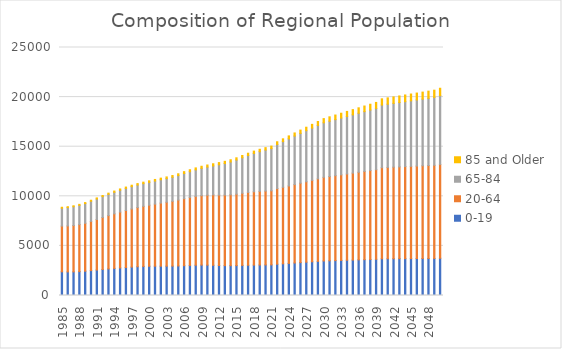
| Category | 0-19  | 20-64 | 65-84 | 85 and Older |
|---|---|---|---|---|
| 1985.0 | 2388.283 | 4611.47 | 1803.225 | 91.523 |
| 1986.0 | 2379.347 | 4632.298 | 1846.96 | 93.928 |
| 1987.0 | 2384.399 | 4671.17 | 1893.194 | 96.044 |
| 1988.0 | 2408.682 | 4743.946 | 1937.765 | 98.385 |
| 1989.0 | 2450.762 | 4830.949 | 1983.835 | 101.109 |
| 1990.0 | 2510.256 | 4960.16 | 2029.072 | 104.161 |
| 1991.0 | 2566.046 | 5095.178 | 2066.251 | 109.24 |
| 1992.0 | 2624.206 | 5236.776 | 2104.465 | 114.738 |
| 1993.0 | 2680.556 | 5375.233 | 2140.87 | 120.306 |
| 1994.0 | 2730.581 | 5502.113 | 2171.887 | 125.732 |
| 1995.0 | 2779.408 | 5628.396 | 2201.745 | 131.247 |
| 1996.0 | 2822.417 | 5744.531 | 2226.803 | 136.625 |
| 1997.0 | 2864.542 | 5860.115 | 2250.524 | 142.057 |
| 1998.0 | 2901.103 | 5965.095 | 2269.469 | 147.318 |
| 1999.0 | 2931.8 | 6058.534 | 2283.606 | 152.384 |
| 2000.0 | 2949.837 | 6154.957 | 2298.393 | 158.09 |
| 2001.0 | 2956.384 | 6258.624 | 2320.842 | 161.891 |
| 2002.0 | 2957.816 | 6359.793 | 2347.715 | 165.79 |
| 2003.0 | 2959.294 | 6443.745 | 2378.855 | 170.704 |
| 2004.0 | 2965.905 | 6532.775 | 2418.828 | 175.623 |
| 2005.0 | 2978.099 | 6641.803 | 2468.407 | 182.011 |
| 2006.0 | 3004.319 | 6761.073 | 2529.442 | 189.933 |
| 2007.0 | 3031.962 | 6855.163 | 2593.247 | 196.749 |
| 2008.0 | 3054.274 | 6933.755 | 2671.749 | 202.58 |
| 2009.0 | 3067.056 | 6998.775 | 2753.224 | 209.154 |
| 2010.0 | 3063.497 | 7050.405 | 2828.206 | 214.441 |
| 2011.0 | 3045.768 | 7101.034 | 2914.53 | 218.01 |
| 2012.0 | 3024.226 | 7105.393 | 3047.946 | 220.982 |
| 2013.0 | 3011.72 | 7117.353 | 3173.711 | 223.402 |
| 2014.0 | 3008.963 | 7145.881 | 3303.497 | 225.489 |
| 2015.0 | 3016.185 | 7198.361 | 3437.848 | 227.523 |
| 2016.0 | 3034.614 | 7272.255 | 3578.342 | 228.671 |
| 2017.0 | 3051.775 | 7339.653 | 3721.648 | 230.123 |
| 2018.0 | 3065.155 | 7390.412 | 3865.535 | 234.613 |
| 2019.0 | 3074.494 | 7423.028 | 4002.287 | 239.949 |
| 2020.0 | 3081.99 | 7445.473 | 4131.702 | 246.134 |
| 2021.0 | 3089.176 | 7463.724 | 4253.722 | 253.403 |
| 2022.0 | 3155.757 | 7623.006 | 4451.608 | 266.956 |
| 2023.0 | 3194.743 | 7713.837 | 4604.884 | 279.875 |
| 2024.0 | 3235.288 | 7807.161 | 4752.008 | 294.897 |
| 2025.0 | 3277.11 | 7903.993 | 4892.128 | 312.136 |
| 2026.0 | 3317.782 | 8002.155 | 5023.127 | 331.324 |
| 2027.0 | 3358.425 | 8104.726 | 5148.002 | 352.257 |
| 2028.0 | 3398.996 | 8211.063 | 5267.798 | 374.574 |
| 2029.0 | 3439.464 | 8320.547 | 5383.512 | 397.929 |
| 2030.0 | 3479.796 | 8432.593 | 5496.094 | 421.991 |
| 2031.0 | 3499.058 | 8495.896 | 5573.161 | 443.811 |
| 2032.0 | 3518.298 | 8560.935 | 5648.573 | 465.572 |
| 2033.0 | 3537.502 | 8627.203 | 5723.056 | 487.067 |
| 2034.0 | 3556.668 | 8694.25 | 5797.237 | 508.125 |
| 2035.0 | 3575.777 | 8761.704 | 5871.633 | 528.619 |
| 2036.0 | 3594.81 | 8829.234 | 5946.68 | 548.46 |
| 2037.0 | 3613.759 | 8896.543 | 6022.737 | 567.597 |
| 2038.0 | 3632.616 | 8963.393 | 6100.065 | 586.014 |
| 2039.0 | 3651.401 | 9029.668 | 6178.779 | 603.692 |
| 2040.0 | 3704.055 | 9179.343 | 6316.688 | 626.357 |
| 2041.0 | 3706.909 | 9205.043 | 6371.334 | 639.959 |
| 2042.0 | 3709.895 | 9230.182 | 6427.143 | 652.824 |
| 2043.0 | 3713.039 | 9254.756 | 6484.02 | 665.03 |
| 2044.0 | 3716.358 | 9278.802 | 6541.827 | 676.66 |
| 2045.0 | 3719.879 | 9302.366 | 6600.409 | 687.794 |
| 2046.0 | 3723.621 | 9325.536 | 6659.577 | 698.516 |
| 2047.0 | 3727.7 | 9348.531 | 6718.988 | 708.831 |
| 2048.0 | 3731.41 | 9371.205 | 6778.685 | 719.552 |
| 2049.0 | 3734.986 | 9393.607 | 6838.65 | 730.409 |
| 2050.0 | 3755.833 | 9459.567 | 6931 | 744.855 |